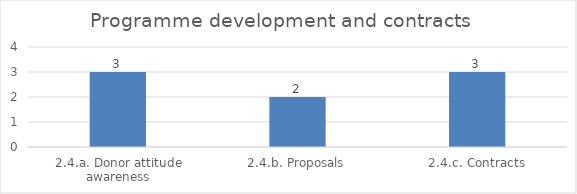
| Category | Programme development and contracts |
|---|---|
| 2.4.a. Donor attitude awareness | 3 |
| 2.4.b. Proposals | 2 |
| 2.4.c. Contracts | 3 |